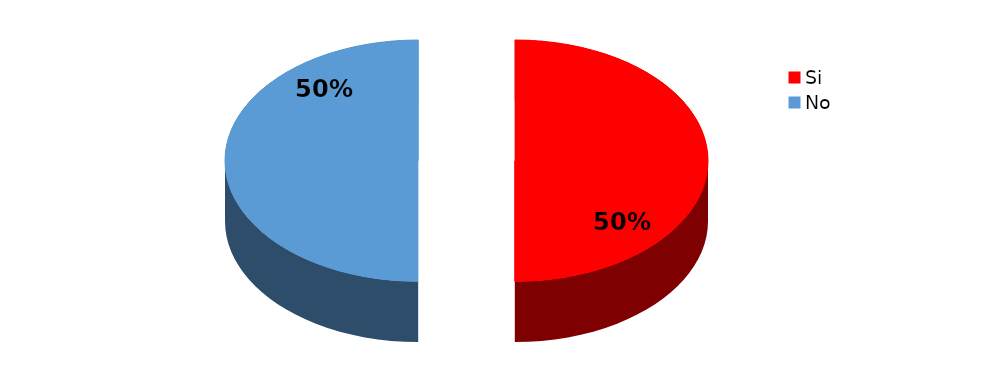
| Category | Series 0 |
|---|---|
| Si | 3 |
| No | 3 |